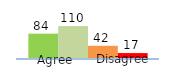
| Category | Series 0 | Series 1 | Series 2 | Series 3 |
|---|---|---|---|---|
| 0 | 84 | 110 | 42 | 17 |